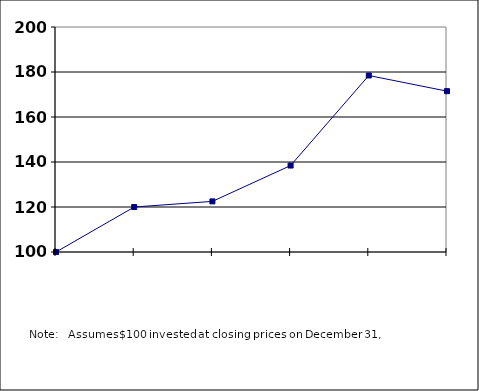
| Category |  100.00  |
|---|---|
| nan | 100 |
| 2011.0 | 119.987 |
| 2012.0 | 122.495 |
| 2013.0 | 138.428 |
| 2014.0 | 178.446 |
| 2015.0 | 171.48 |